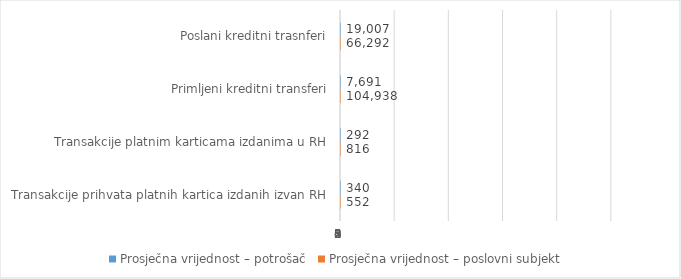
| Category | Prosječna vrijednost – potrošač | Prosječna vrijednost – poslovni subjekt  |
|---|---|---|
| Poslani kreditni trasnferi | 19007.428 | 66291.832 |
| Primljeni kreditni transferi | 7690.533 | 104937.579 |
| Transakcije platnim karticama izdanima u RH | 291.97 | 815.655 |
| Transakcije prihvata platnih kartica izdanih izvan RH | 340.042 | 551.755 |